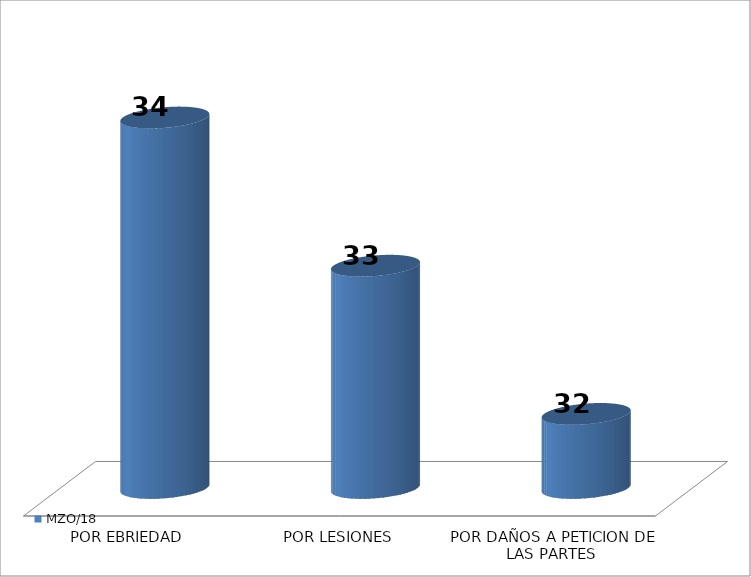
| Category | MZO/18 |
|---|---|
| POR EBRIEDAD | 34 |
| POR LESIONES | 33 |
| POR DAÑOS A PETICION DE LAS PARTES | 32 |